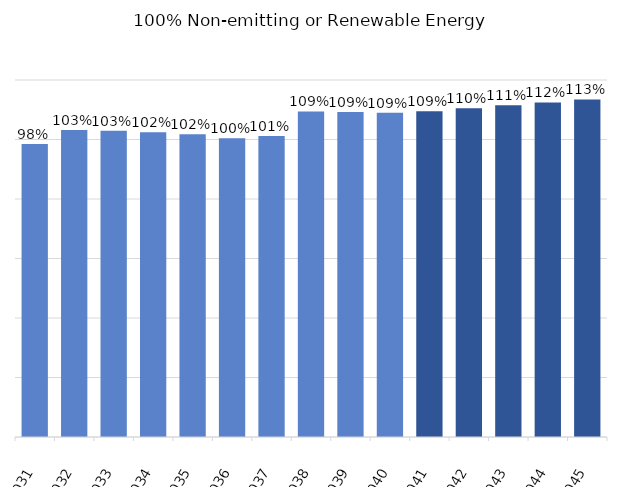
| Category | Percentage Clean Energy |
|---|---|
| 2031.0 | 0.985 |
| 2032.0 | 1.032 |
| 2033.0 | 1.029 |
| 2034.0 | 1.025 |
| 2035.0 | 1.017 |
| 2036.0 | 1.005 |
| 2037.0 | 1.012 |
| 2038.0 | 1.094 |
| 2039.0 | 1.092 |
| 2040.0 | 1.09 |
| 2041.0 | 1.095 |
| 2042.0 | 1.105 |
| 2043.0 | 1.115 |
| 2044.0 | 1.125 |
| 2045.0 | 1.134 |